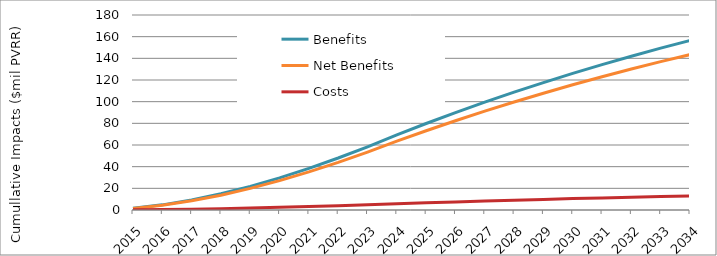
| Category | Benefits | Net Benefits | Costs |
|---|---|---|---|
| 2015.0 | 1627378.521 | 1491763.644 | 135614.877 |
| 2016.0 | 4743307.063 | 4348031.474 | 395275.589 |
| 2017.0 | 9217839.519 | 8449686.226 | 768153.293 |
| 2018.0 | 14929407.014 | 13685289.763 | 1244117.251 |
| 2019.0 | 21764339.68 | 19950644.707 | 1813694.973 |
| 2020.0 | 29616413.985 | 27148379.486 | 2468034.499 |
| 2021.0 | 38386424.306 | 35187555.614 | 3198868.692 |
| 2022.0 | 47981777.508 | 43983296.049 | 3998481.459 |
| 2023.0 | 58316109.333 | 53456433.555 | 4859675.778 |
| 2024.0 | 69308921.49 | 63533178.033 | 5775743.458 |
| 2025.0 | 79832845.925 | 73180108.765 | 6652737.16 |
| 2026.0 | 89907882.588 | 82415559.039 | 7492323.549 |
| 2027.0 | 99553178.351 | 91257080.155 | 8296098.196 |
| 2028.0 | 108787063.394 | 99721474.778 | 9065588.616 |
| 2029.0 | 117627086.042 | 107824828.871 | 9802257.17 |
| 2030.0 | 126090046.112 | 115582542.269 | 10507503.843 |
| 2031.0 | 134192026.843 | 123009357.939 | 11182668.904 |
| 2032.0 | 141948425.457 | 130119390.002 | 11829035.455 |
| 2033.0 | 149373982.424 | 136926150.556 | 12447831.869 |
| 2034.0 | 156482809.473 | 143442575.351 | 13040234.123 |